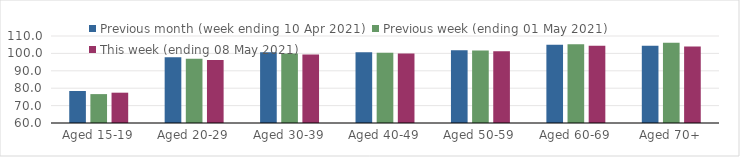
| Category | Previous month (week ending 10 Apr 2021) | Previous week (ending 01 May 2021) | This week (ending 08 May 2021) |
|---|---|---|---|
| Aged 15-19 | 78.38 | 76.61 | 77.42 |
| Aged 20-29 | 97.8 | 96.86 | 96.25 |
| Aged 30-39 | 100.67 | 99.97 | 99.33 |
| Aged 40-49 | 100.7 | 100.37 | 99.91 |
| Aged 50-59 | 101.86 | 101.6 | 101.28 |
| Aged 60-69 | 104.94 | 105.27 | 104.45 |
| Aged 70+ | 104.33 | 106.13 | 103.93 |